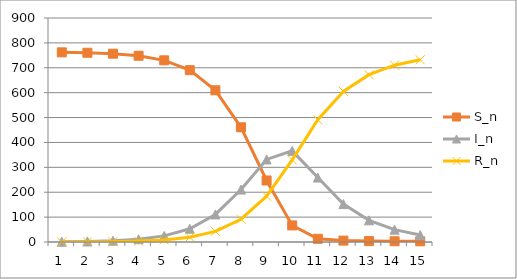
| Category | S_n | I_n | R_n |
|---|---|---|---|
| 0 | 762 | 1 | 0 |
| 1 | 760.322 | 2.238 | 0.44 |
| 2 | 756.576 | 4.999 | 1.425 |
| 3 | 748.247 | 11.128 | 3.624 |
| 4 | 729.914 | 24.565 | 8.521 |
| 5 | 690.433 | 53.237 | 19.33 |
| 6 | 609.501 | 110.745 | 42.754 |
| 7 | 460.879 | 210.639 | 91.482 |
| 8 | 247.127 | 331.71 | 184.163 |
| 9 | 66.633 | 366.252 | 330.115 |
| 10 | 12.898 | 258.835 | 491.266 |
| 11 | 5.547 | 152.299 | 605.154 |
| 12 | 3.687 | 87.148 | 672.165 |
| 13 | 2.98 | 49.51 | 710.51 |
| 14 | 2.655 | 28.05 | 732.295 |